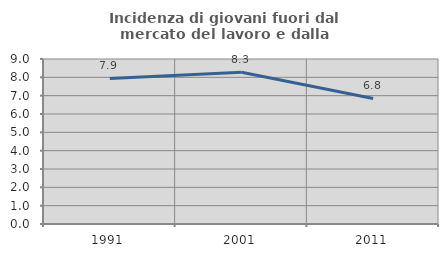
| Category | Incidenza di giovani fuori dal mercato del lavoro e dalla formazione  |
|---|---|
| 1991.0 | 7.937 |
| 2001.0 | 8.279 |
| 2011.0 | 6.849 |